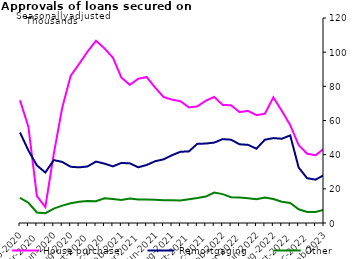
| Category | House purchase | Remortgaging | Other |
|---|---|---|---|
| Feb-2020 | 71834 | 52968 | 14713 |
| Mar-2020 | 56168 | 42425 | 11861 |
| Apr-2020 | 15794 | 33719 | 6147 |
| May-2020 | 9304 | 29555 | 5745 |
| Jun-2020 | 40471 | 36831 | 8426 |
| Jul-2020 | 67491 | 35742 | 10150 |
| Aug-2020 | 86138 | 32918 | 11586 |
| Sep-2020 | 93086 | 32564 | 12443 |
| Oct-2020 | 100361 | 33106 | 12909 |
| Nov-2020 | 106660 | 35949 | 12719 |
| Dec-2020 | 102250 | 34763 | 14509 |
| Jan-2021 | 96811 | 33151 | 14015 |
| Feb-2021 | 85182 | 35162 | 13481 |
| Mar-2021 | 80846 | 34931 | 14292 |
| Apr-2021 | 84440 | 32609 | 13762 |
| May-2021 | 85447 | 33953 | 13717 |
| Jun-2021 | 79308 | 36156 | 13607 |
| Jul-2021 | 73770 | 37252 | 13349 |
| Aug-2021 | 72202 | 39675 | 13355 |
| Sep-2021 | 71294 | 41693 | 13108 |
| Oct-2021 | 67667 | 41900 | 13964 |
| Nov-2021 | 68242 | 46348 | 14590 |
| Dec-2021 | 71566 | 46507 | 15462 |
| Jan-2022 | 73801 | 47061 | 17804 |
| Feb-2022 | 69135 | 49108 | 16909 |
| Mar-2022 | 68901 | 48749 | 15046 |
| Apr-2022 | 64906 | 46076 | 14912 |
| May-2022 | 65635 | 45745 | 14517 |
| Jun-2022 | 63123 | 43497 | 13866 |
| Jul-2022 | 63945 | 48760 | 14943 |
| Aug-2022 | 73559 | 49695 | 14085 |
| Sep-2022 | 65696 | 49322 | 12407 |
| Oct-2022 | 57284 | 51262 | 11690 |
| Nov-2022 | 45558 | 32458 | 8026 |
| Dec-2022 | 40552 | 26231 | 6466 |
| Jan-2023 | 39647 | 25364 | 6431 |
| Feb-2023 | 43536 | 28093 | 7707 |